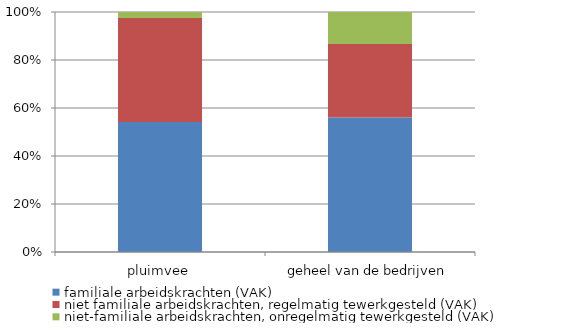
| Category | familiale arbeidskrachten (VAK) | niet familiale arbeidskrachten, regelmatig tewerkgesteld (VAK) | niet-familiale arbeidskrachten, onregelmatig tewerkgesteld (VAK) |
|---|---|---|---|
| pluimvee | 545.13 | 435.25 | 25.6 |
| geheel van de bedrijven | 22042.63 | 12010.25 | 5262.07 |